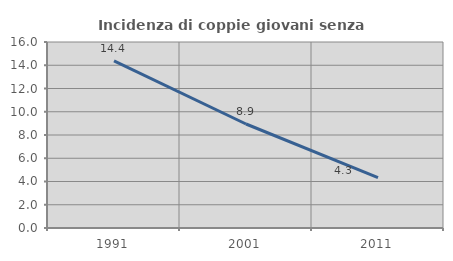
| Category | Incidenza di coppie giovani senza figli |
|---|---|
| 1991.0 | 14.379 |
| 2001.0 | 8.947 |
| 2011.0 | 4.331 |